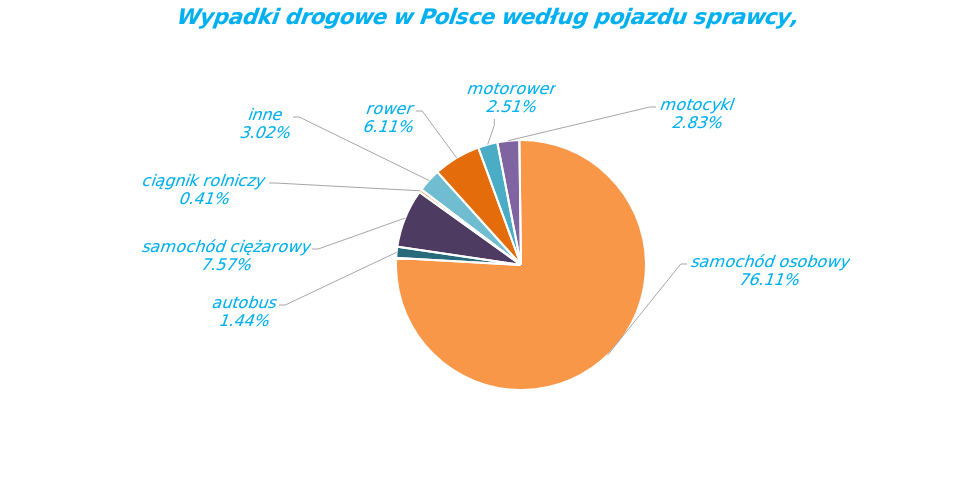
| Category | Series 0 |
|---|---|
| rower | 1778 |
| motorower | 731 |
| motocykl | 823 |
| samochód osobowy | 22134 |
| autobus | 419 |
| samochód ciężarowy | 2201 |
| ciągnik rolniczy | 118 |
| inne | 877 |